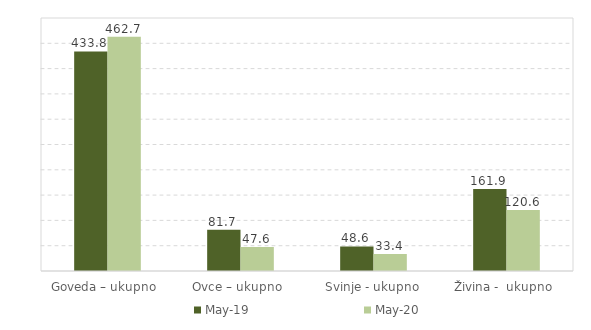
| Category | May-19 | May-20 |
|---|---|---|
| Goveda – ukupno  | 433.8 | 462.7 |
| Ovce – ukupno  | 81.7 | 47.6 |
| Svinje - ukupno | 48.6 | 33.4 |
| Živina -  ukupno  | 161.9 | 120.6 |